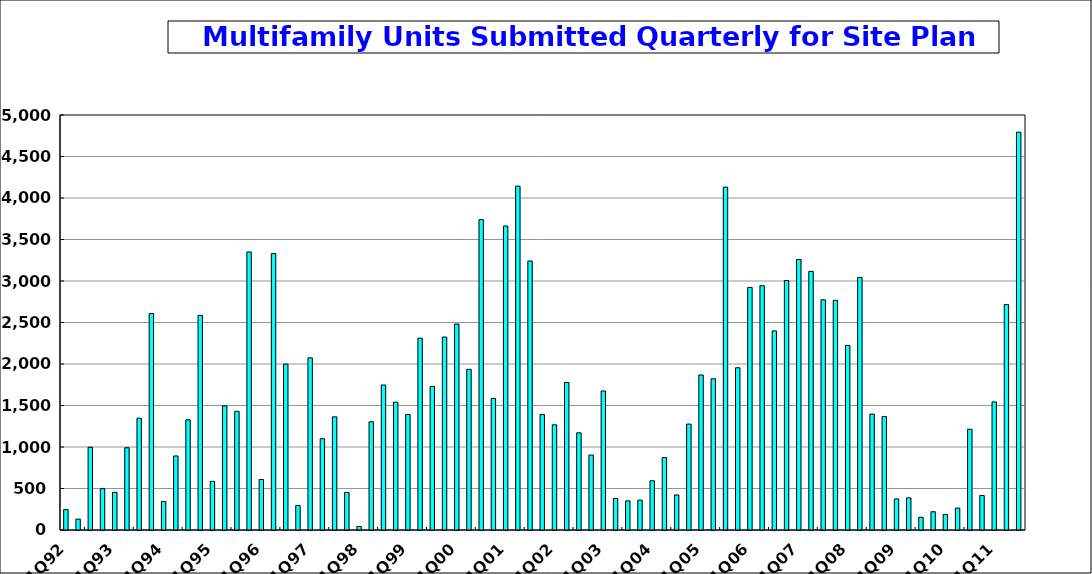
| Category | Series 0 |
|---|---|
| 1Q92 | 246 |
| 2Q92 | 131 |
| 3Q92 | 997 |
| 4Q92 | 498 |
| 1Q93 | 454 |
| 2Q93 | 991 |
| 3Q93 | 1347 |
| 4Q93 | 2608 |
| 1Q94 | 344 |
| 2Q94 | 892 |
| 3Q94 | 1327 |
| 4Q94 | 2586 |
| 1Q95 | 586 |
| 2Q95 | 1495 |
| 3Q95 | 1430 |
| 4Q95 | 3350 |
| 1Q96 | 608 |
| 2Q96 | 3331 |
| 3Q96 | 1999 |
| 4Q96 | 296 |
| 1Q97 | 2074 |
| 2Q97 | 1100 |
| 3Q97 | 1363 |
| 4Q97 | 453 |
| 1Q98 | 43 |
| 2Q98 | 1304 |
| 3Q98 | 1747 |
| 4Q98 | 1540 |
| 1Q99 | 1392 |
| 2Q99 | 2311 |
| 3Q99 | 1729 |
| 4Q99 | 2324.56 |
| 1Q00 | 2481 |
| 2Q00 | 1936 |
| 3Q00 | 3739 |
| 4Q00 | 1585 |
| 1Q01 | 3662 |
| 2Q01 | 4143 |
| 3Q01 | 3241 |
| 4Q01 | 1391 |
| 1Q02 | 1267 |
| 2Q02 | 1777 |
| 3Q02 | 1171 |
| 4Q02 | 903 |
| 1Q03 | 1675 |
| 2Q03 | 379 |
| 3Q03 | 351 |
| 4Q03 | 360 |
| 1Q04 | 593 |
| 2Q04 | 872 |
| 3Q04 | 422 |
| 4Q04 | 1276 |
| 1Q05 | 1868 |
| 2Q05 | 1822 |
| 3Q05 | 4131 |
| 4Q05 | 1955 |
| 1Q06 | 2923 |
| 2Q06 | 2943 |
| 3Q06 | 2399 |
| 4Q06 | 3006 |
| 1Q07 | 3259 |
| 2Q07 | 3116 |
| 3Q07 | 2773 |
| 4Q07 | 2767 |
| 1Q08 | 2224 |
| 2Q08 | 3043 |
| 3Q08 | 1397 |
| 4Q08 | 1368 |
| 1Q09 | 374 |
| 2Q09 | 387 |
| 3Q09 | 153 |
| 4Q09 | 220 |
| 1Q10 | 187 |
| 2Q10 | 264 |
| 3Q10 | 1214 |
| 4Q10 | 416 |
| 1Q11 | 1543 |
| 2Q11 | 2716 |
| 3Q11 | 4793 |